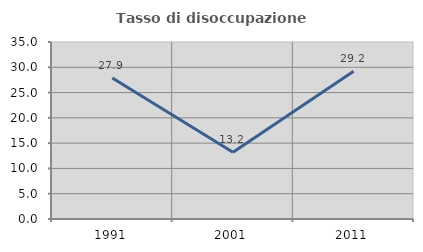
| Category | Tasso di disoccupazione giovanile  |
|---|---|
| 1991.0 | 27.881 |
| 2001.0 | 13.194 |
| 2011.0 | 29.231 |